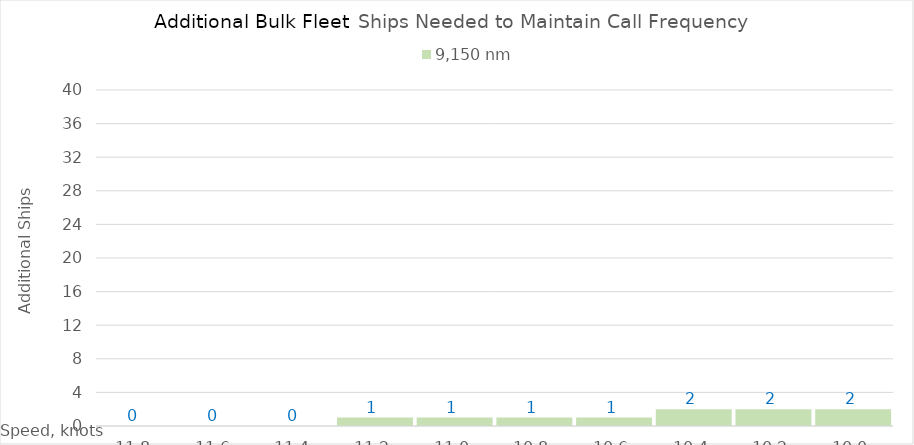
| Category | 9,150 |
|---|---|
| 11.8 | 0 |
| 11.600000000000001 | 0 |
| 11.400000000000002 | 0 |
| 11.200000000000003 | 1 |
| 11.000000000000004 | 1 |
| 10.800000000000004 | 1 |
| 10.600000000000005 | 1 |
| 10.400000000000006 | 2 |
| 10.200000000000006 | 2 |
| 10.000000000000007 | 2 |